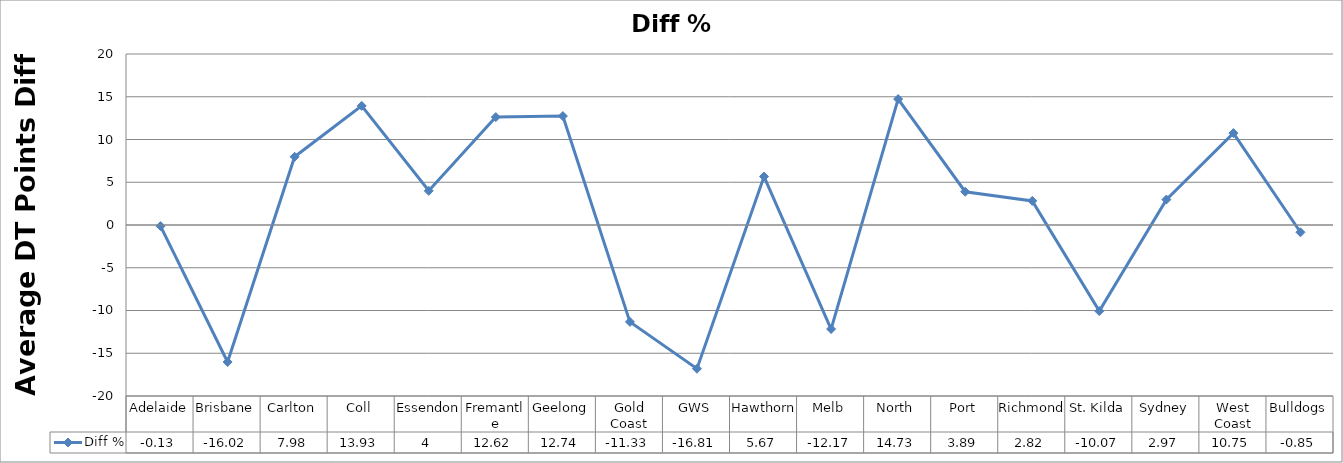
| Category | Diff % |
|---|---|
| Adelaide | -0.13 |
| Brisbane | -16.02 |
| Carlton | 7.98 |
| Coll | 13.93 |
| Essendon | 4 |
| Fremantle | 12.62 |
| Geelong | 12.74 |
| Gold Coast | -11.33 |
| GWS | -16.81 |
| Hawthorn | 5.67 |
| Melb | -12.17 |
| North | 14.73 |
| Port | 3.89 |
| Richmond | 2.82 |
| St. Kilda | -10.07 |
| Sydney | 2.97 |
| West Coast | 10.75 |
| Bulldogs | -0.85 |